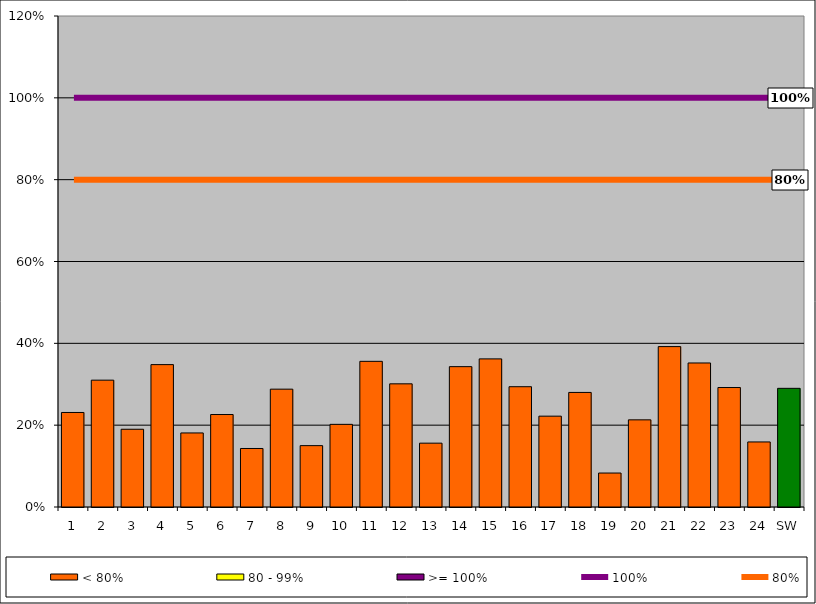
| Category | < 80% | 80 - 99% | >= 100% |
|---|---|---|---|
| 1 | 0.231 | 0 | 0 |
| 2 | 0.31 | 0 | 0 |
| 3 | 0.19 | 0 | 0 |
| 4 | 0.348 | 0 | 0 |
| 5 | 0.181 | 0 | 0 |
| 6 | 0.226 | 0 | 0 |
| 7 | 0.143 | 0 | 0 |
| 8 | 0.288 | 0 | 0 |
| 9 | 0.15 | 0 | 0 |
| 10 | 0.202 | 0 | 0 |
| 11 | 0.356 | 0 | 0 |
| 12 | 0.301 | 0 | 0 |
| 13 | 0.156 | 0 | 0 |
| 14 | 0.343 | 0 | 0 |
| 15 | 0.362 | 0 | 0 |
| 16 | 0.294 | 0 | 0 |
| 17 | 0.222 | 0 | 0 |
| 18 | 0.28 | 0 | 0 |
| 19 | 0.083 | 0 | 0 |
| 20 | 0.213 | 0 | 0 |
| 21 | 0.392 | 0 | 0 |
| 22 | 0.352 | 0 | 0 |
| 23 | 0.292 | 0 | 0 |
| 24 | 0.159 | 0 | 0 |
| SW | 0.29 | 0 | 0 |